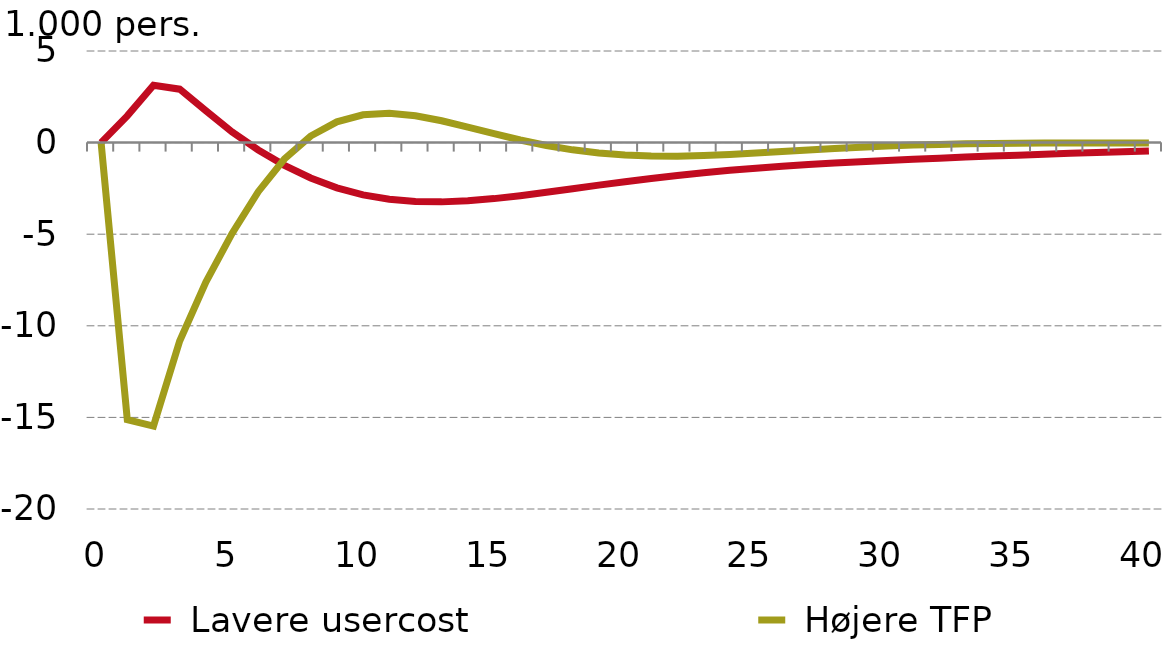
| Category |  Lavere usercost |  Højere TFP |
|---|---|---|
| 0.0 | 0 | 0 |
| nan | 1.46 | -15.119 |
| nan | 3.133 | -15.474 |
| nan | 2.916 | -10.834 |
| nan | 1.738 | -7.616 |
| 5.0 | 0.579 | -4.958 |
| nan | -0.402 | -2.678 |
| nan | -1.239 | -0.894 |
| nan | -1.931 | 0.358 |
| nan | -2.468 | 1.133 |
| 10.0 | -2.851 | 1.517 |
| nan | -3.094 | 1.599 |
| nan | -3.215 | 1.465 |
| nan | -3.235 | 1.194 |
| nan | -3.176 | 0.85 |
| 15.0 | -3.057 | 0.487 |
| nan | -2.898 | 0.143 |
| nan | -2.714 | -0.156 |
| nan | -2.519 | -0.396 |
| nan | -2.322 | -0.57 |
| 20.0 | -2.133 | -0.68 |
| nan | -1.955 | -0.733 |
| nan | -1.792 | -0.738 |
| nan | -1.644 | -0.706 |
| nan | -1.513 | -0.647 |
| 25.0 | -1.396 | -0.571 |
| nan | -1.292 | -0.487 |
| nan | -1.2 | -0.403 |
| nan | -1.118 | -0.323 |
| nan | -1.043 | -0.251 |
| 30.0 | -0.974 | -0.189 |
| nan | -0.91 | -0.138 |
| nan | -0.85 | -0.097 |
| nan | -0.793 | -0.067 |
| nan | -0.738 | -0.045 |
| 35.0 | -0.685 | -0.031 |
| nan | -0.635 | -0.022 |
| nan | -0.586 | -0.018 |
| nan | -0.54 | -0.016 |
| nan | -0.496 | -0.015 |
| 40.0 | -0.454 | -0.016 |